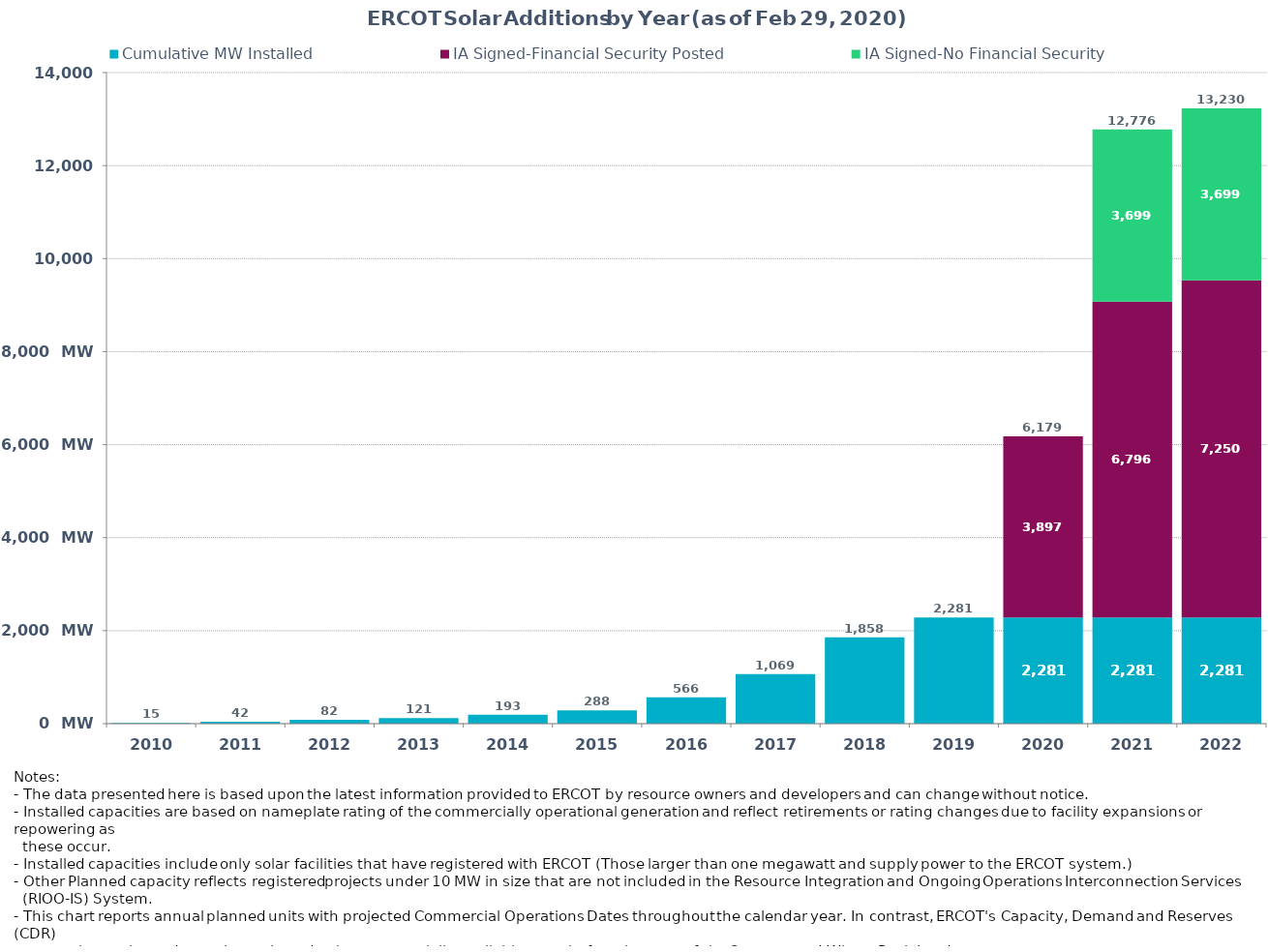
| Category | Cumulative MW Installed | IA Signed-Financial Security Posted  | IA Signed-No Financial Security  | Other Planned | Cumulative Installed and Planned |
|---|---|---|---|---|---|
| 2010.0 | 15 | 0 | 0 | 0 | 15 |
| 2011.0 | 42 | 0 | 0 | 0 | 42 |
| 2012.0 | 82 | 0 | 0 | 0 | 82 |
| 2013.0 | 121 | 0 | 0 | 0 | 121 |
| 2014.0 | 193 | 0 | 0 | 0 | 193 |
| 2015.0 | 287.7 | 0 | 0 | 0 | 287.7 |
| 2016.0 | 566.4 | 0 | 0 | 0 | 566.4 |
| 2017.0 | 1068.7 | 0 | 0 | 0 | 1068.7 |
| 2018.0 | 1857.7 | 0 | 0 | 0 | 1857.7 |
| 2019.0 | 2281.4 | 0 | 0 | 0 | 2281.4 |
| 2020.0 | 2281.42 | 3897.41 | 0 | 0 | 6178.83 |
| 2021.0 | 2281 | 6796.4 | 3699.03 | 0 | 12776.43 |
| 2022.0 | 2281.42 | 7249.6 | 3699.03 | 0 | 13230.05 |